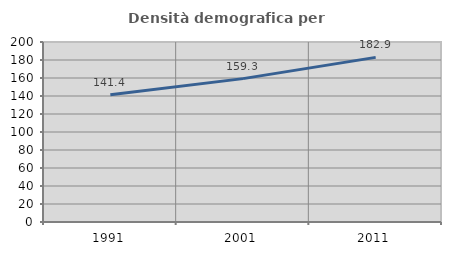
| Category | Densità demografica |
|---|---|
| 1991.0 | 141.367 |
| 2001.0 | 159.301 |
| 2011.0 | 182.932 |